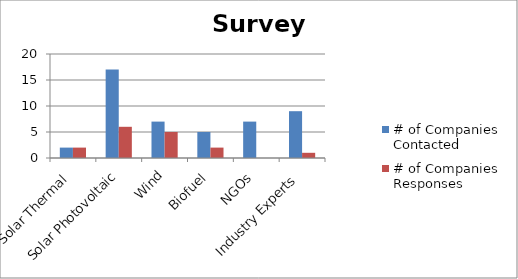
| Category | # of Companies Contacted | # of Companies Responses |
|---|---|---|
| Solar Thermal | 2 | 2 |
| Solar Photovoltaic | 17 | 6 |
| Wind | 7 | 5 |
| Biofuel | 5 | 2 |
| NGOs | 7 | 0 |
| Industry Experts | 9 | 1 |